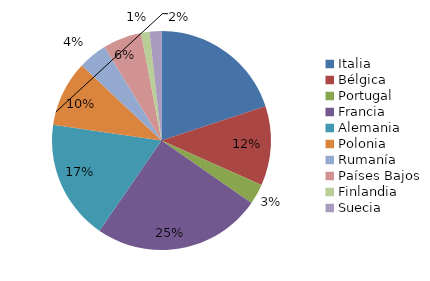
| Category | Series 0 |
|---|---|
| Italia | 80 |
| Bélgica | 47 |
| Portugal | 12 |
| Francia | 100 |
| Alemania | 71 |
| Polonia | 39 |
| Rumanía | 17 |
| Países Bajos | 23 |
| Finlandia | 5 |
| Suecia | 7 |